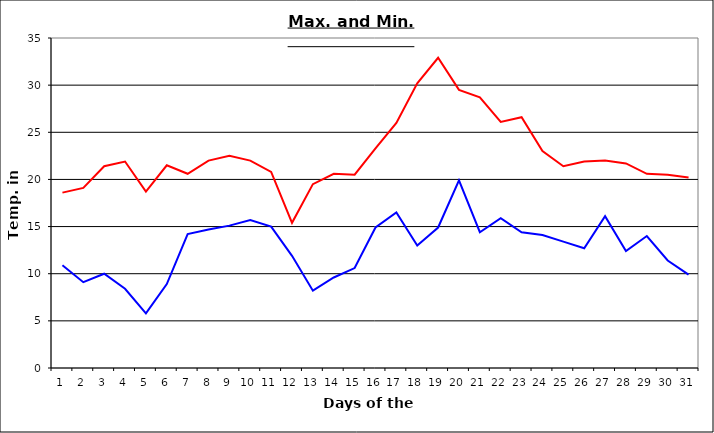
| Category | Series 0 | Series 1 |
|---|---|---|
| 0 | 18.6 | 10.9 |
| 1 | 19.1 | 9.1 |
| 2 | 21.4 | 10 |
| 3 | 21.9 | 8.4 |
| 4 | 18.7 | 5.8 |
| 5 | 21.5 | 8.9 |
| 6 | 20.6 | 14.2 |
| 7 | 22 | 14.7 |
| 8 | 22.5 | 15.1 |
| 9 | 22 | 15.7 |
| 10 | 20.8 | 15 |
| 11 | 15.4 | 11.9 |
| 12 | 19.5 | 8.2 |
| 13 | 20.6 | 9.6 |
| 14 | 20.5 | 10.6 |
| 15 | 23.3 | 14.9 |
| 16 | 26 | 16.5 |
| 17 | 30.2 | 13 |
| 18 | 32.9 | 14.9 |
| 19 | 29.5 | 19.9 |
| 20 | 28.7 | 14.4 |
| 21 | 26.1 | 15.9 |
| 22 | 26.6 | 14.4 |
| 23 | 23 | 14.1 |
| 24 | 21.4 | 13.4 |
| 25 | 21.9 | 12.7 |
| 26 | 22 | 16.1 |
| 27 | 21.7 | 12.4 |
| 28 | 20.6 | 14 |
| 29 | 20.5 | 11.4 |
| 30 | 20.2 | 9.9 |